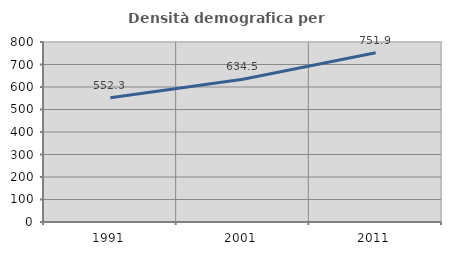
| Category | Densità demografica |
|---|---|
| 1991.0 | 552.33 |
| 2001.0 | 634.508 |
| 2011.0 | 751.874 |